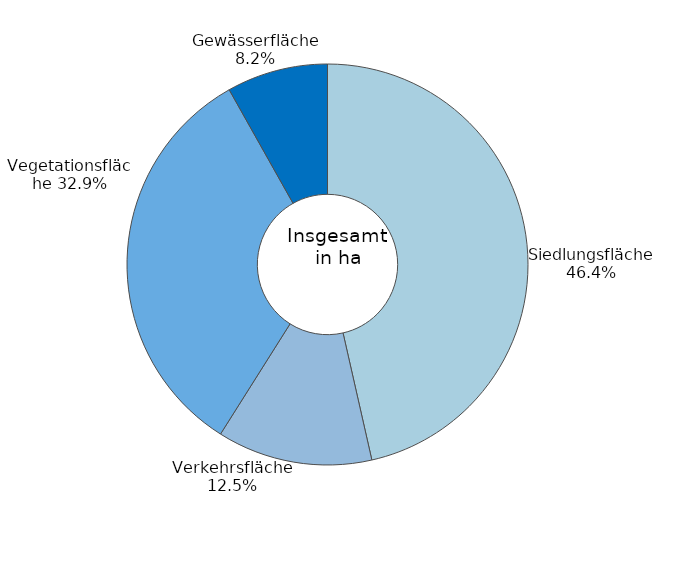
| Category | Series 0 |
|---|---|
| Siedlungsfläche | 0.464 |
| Verkehrsfläche | 0.125 |
| Vegetationsfläche | 0.329 |
| Gewässerfläche | 0.082 |